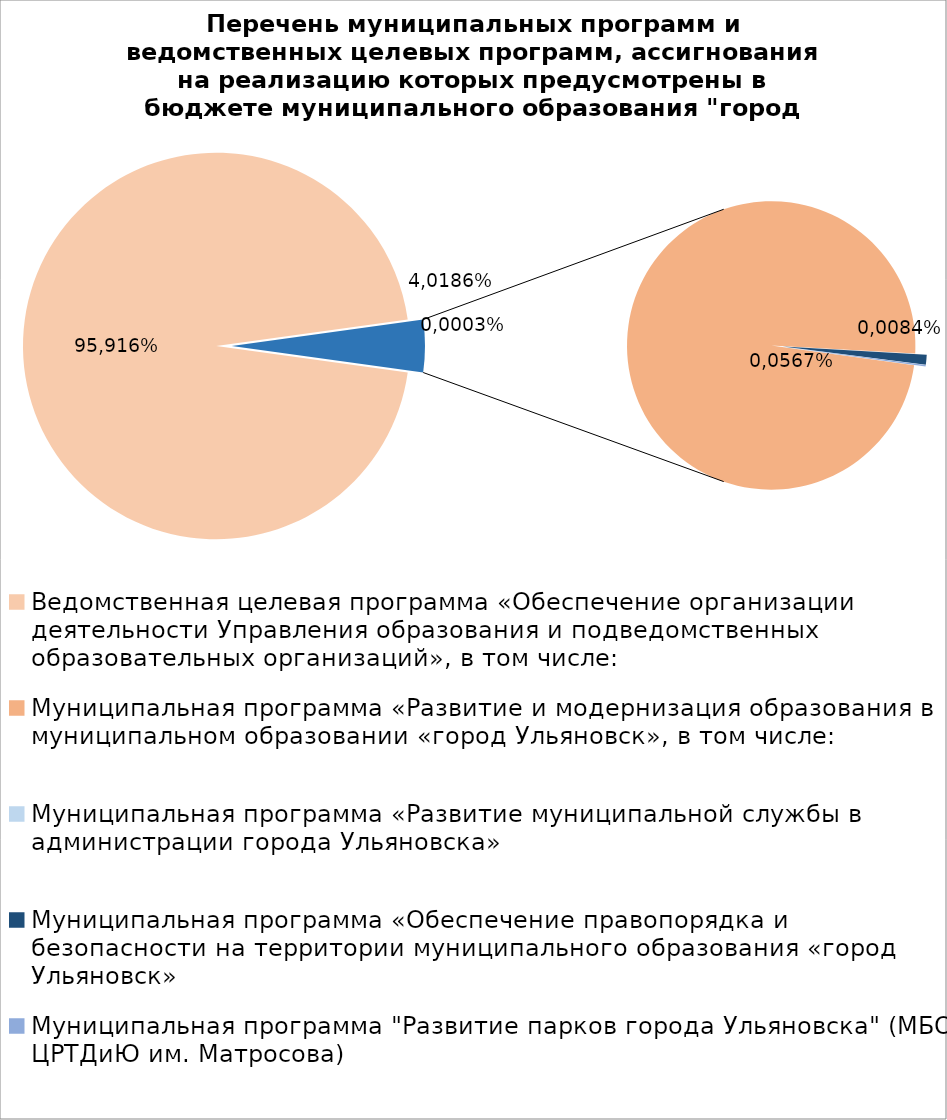
| Category | Series 0 |
|---|---|
| Ведомственная целевая программа «Обеспечение организации деятельности Управления образования и подведомственных образовательных организаций», в том числе: | 5247247.73 |
| Муниципальная программа «Развитие и модернизация образования в муниципальном образовании «город Ульяновск», в том числе: | 237204.5 |
| Муниципальная программа «Развитие муниципальной службы в администрации города Ульяновска» | 15.4 |
| Муниципальная программа «Обеспечение правопорядка и безопасности на территории муниципального образования «город Ульяновск» | 2700 |
| Муниципальная программа "Развитие парков города Ульяновска" (МБОУ ЦРТДиЮ им. Матросова) | 400 |